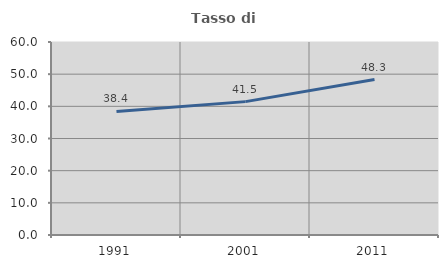
| Category | Tasso di occupazione   |
|---|---|
| 1991.0 | 38.411 |
| 2001.0 | 41.463 |
| 2011.0 | 48.321 |